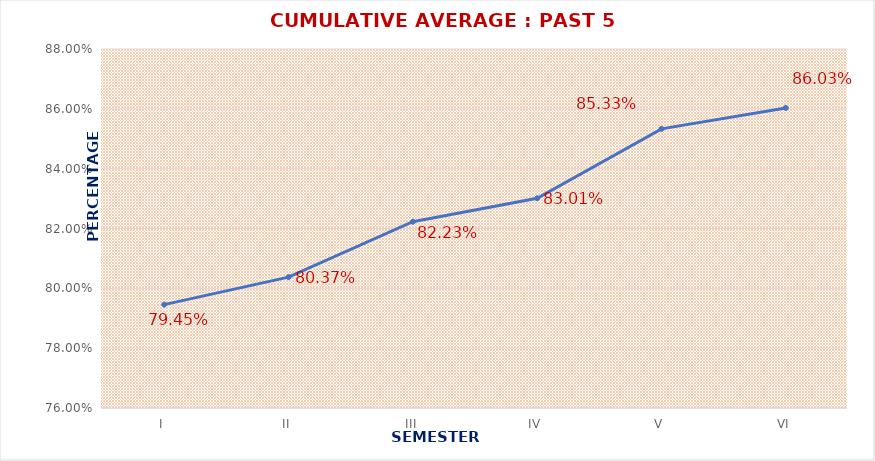
| Category | CUMULATIVE AVERAGE : PAST 5 YEARS |
|---|---|
| I | 0.795 |
| II | 0.804 |
| III | 0.822 |
| IV | 0.83 |
| V | 0.853 |
| VI | 0.86 |